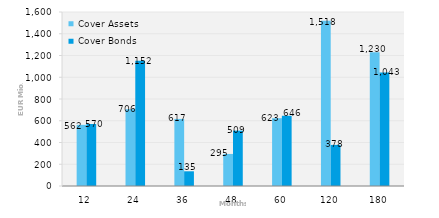
| Category | Cover Assets | Cover Bonds |
|---|---|---|
| 12.0 | 562.13 | 570.3 |
| 24.0 | 706.037 | 1152.462 |
| 36.0 | 616.858 | 135.164 |
| 48.0 | 294.807 | 509 |
| 60.0 | 623.389 | 645.836 |
| 120.0 | 1518.403 | 377.701 |
| 180.0 | 1229.599 | 1043.214 |